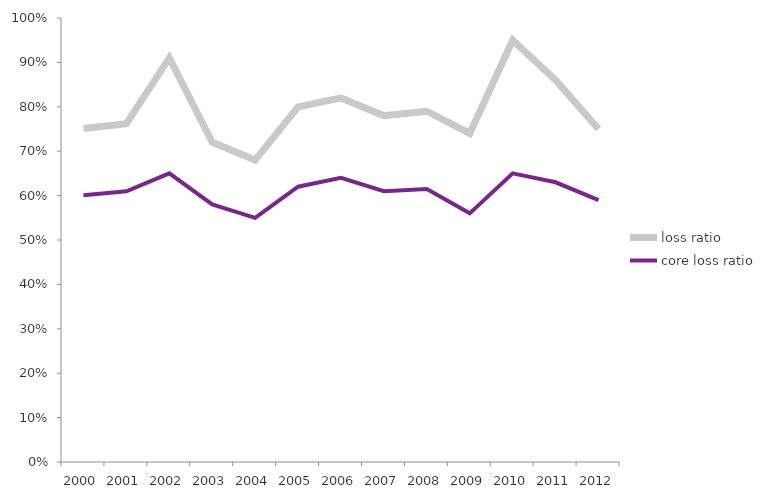
| Category | loss ratio | core loss ratio |
|---|---|---|
| 2000.0 | 0.751 | 0.601 |
| 2001.0 | 0.762 | 0.61 |
| 2002.0 | 0.91 | 0.65 |
| 2003.0 | 0.72 | 0.58 |
| 2004.0 | 0.68 | 0.55 |
| 2005.0 | 0.8 | 0.62 |
| 2006.0 | 0.82 | 0.64 |
| 2007.0 | 0.78 | 0.61 |
| 2008.0 | 0.79 | 0.615 |
| 2009.0 | 0.74 | 0.56 |
| 2010.0 | 0.95 | 0.65 |
| 2011.0 | 0.86 | 0.63 |
| 2012.0 | 0.75 | 0.59 |